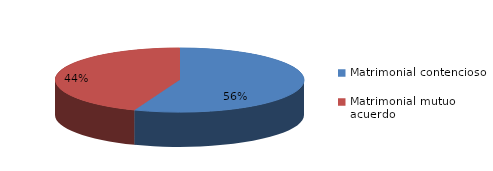
| Category | Series 0 |
|---|---|
| 0 | 795 |
| 1 | 628 |